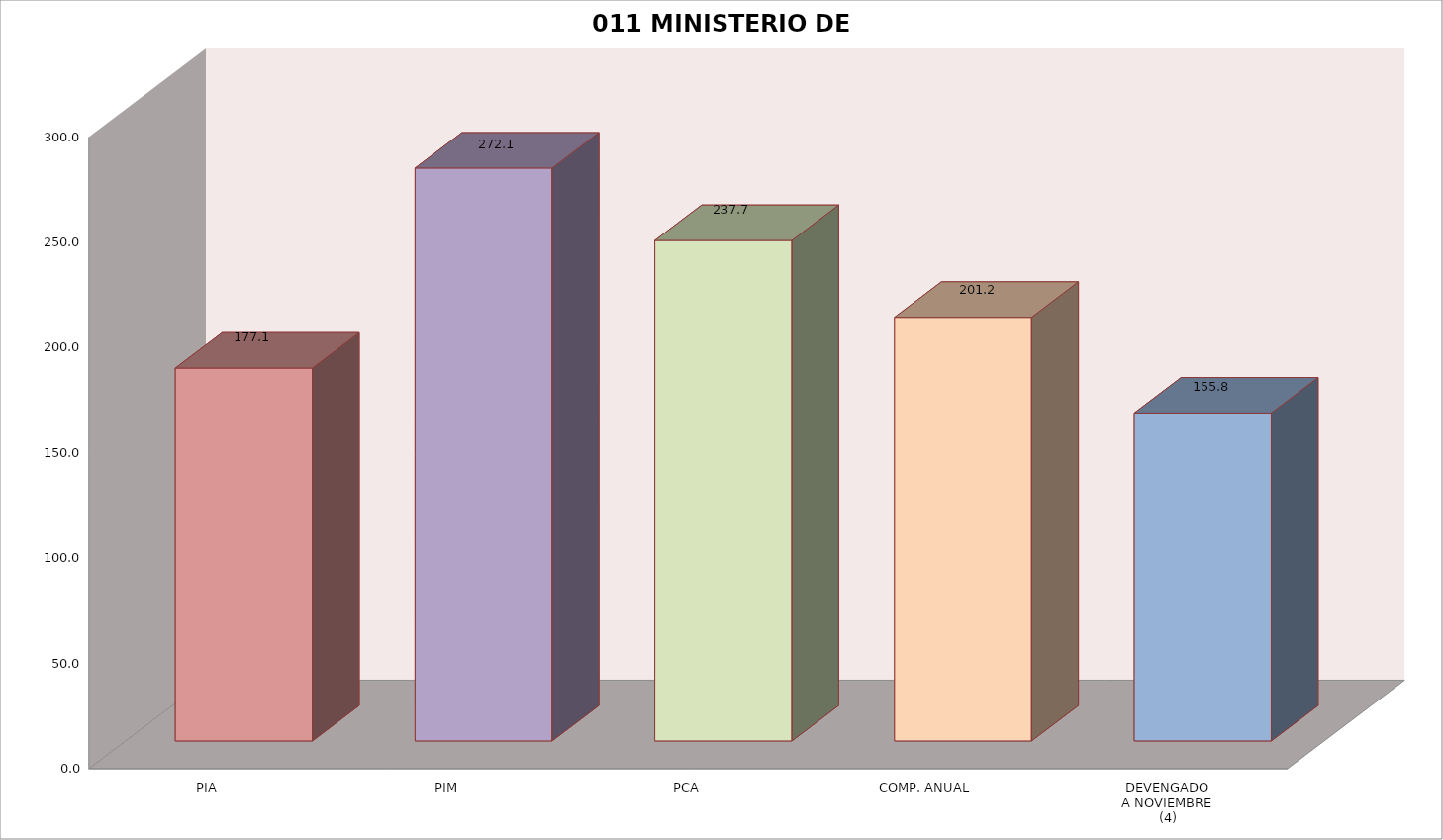
| Category | 011 MINISTERIO DE SALUD |
|---|---|
| PIA | 177.09 |
| PIM | 272.084 |
| PCA | 237.713 |
| COMP. ANUAL | 201.228 |
| DEVENGADO
A NOVIEMBRE
(4) | 155.776 |